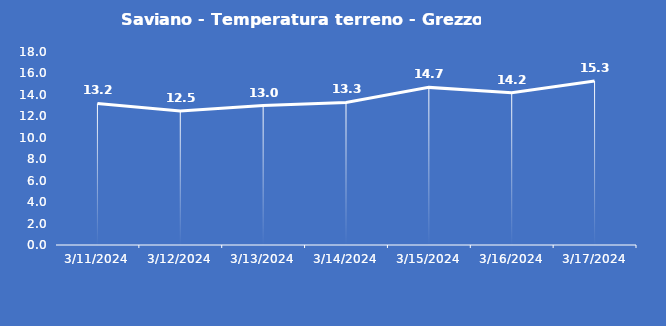
| Category | Saviano - Temperatura terreno - Grezzo (°C) |
|---|---|
| 3/11/24 | 13.2 |
| 3/12/24 | 12.5 |
| 3/13/24 | 13 |
| 3/14/24 | 13.3 |
| 3/15/24 | 14.7 |
| 3/16/24 | 14.2 |
| 3/17/24 | 15.3 |